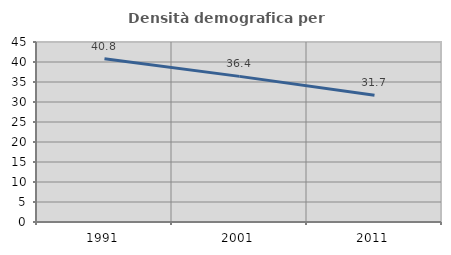
| Category | Densità demografica |
|---|---|
| 1991.0 | 40.797 |
| 2001.0 | 36.405 |
| 2011.0 | 31.709 |